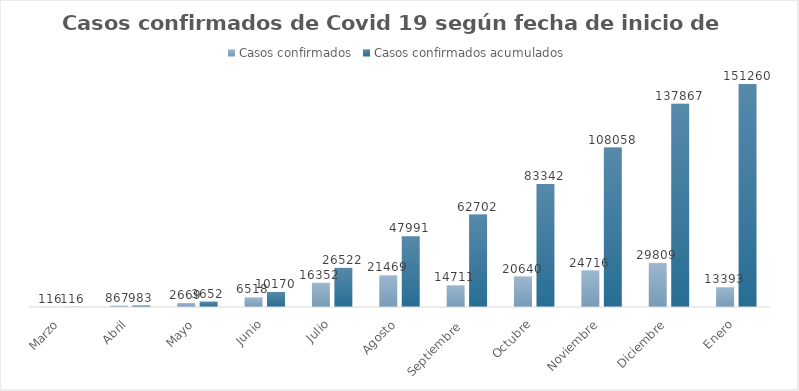
| Category | Casos confirmados | Casos confirmados acumulados |
|---|---|---|
| Marzo | 116 | 116 |
| Abril | 867 | 983 |
| Mayo | 2669 | 3652 |
| Junio | 6518 | 10170 |
| Julio | 16352 | 26522 |
| Agosto | 21469 | 47991 |
| Septiembre  | 14711 | 62702 |
| Octubre | 20640 | 83342 |
| Noviembre | 24716 | 108058 |
| Diciembre | 29809 | 137867 |
| Enero | 13393 | 151260 |